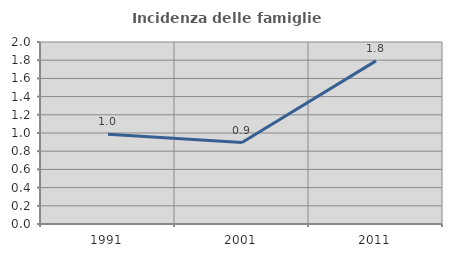
| Category | Incidenza delle famiglie numerose |
|---|---|
| 1991.0 | 0.985 |
| 2001.0 | 0.895 |
| 2011.0 | 1.793 |